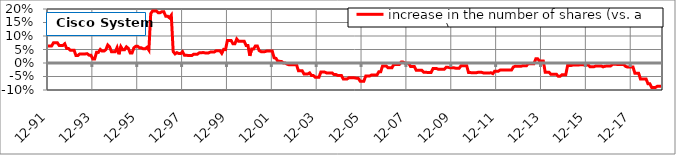
| Category | increase in the number of shares (vs. a year ago) |
|---|---|
| 1991-12-31 | 0.063 |
| 1992-01-31 | 0.063 |
| 1992-02-28 | 0.063 |
| 1992-03-31 | 0.075 |
| 1992-04-30 | 0.075 |
| 1992-05-29 | 0.075 |
| 1992-06-30 | 0.065 |
| 1992-07-31 | 0.065 |
| 1992-08-31 | 0.065 |
| 1992-09-30 | 0.071 |
| 1992-10-30 | 0.054 |
| 1992-11-30 | 0.054 |
| 1992-12-31 | 0.047 |
| 1993-01-29 | 0.047 |
| 1993-02-26 | 0.047 |
| 1993-03-31 | 0.027 |
| 1993-04-30 | 0.028 |
| 1993-05-31 | 0.034 |
| 1993-06-30 | 0.034 |
| 1993-07-30 | 0.034 |
| 1993-08-31 | 0.034 |
| 1993-09-30 | 0.034 |
| 1993-10-29 | 0.029 |
| 1993-11-30 | 0.029 |
| 1993-12-31 | 0.015 |
| 1994-01-31 | 0.015 |
| 1994-02-28 | 0.039 |
| 1994-03-31 | 0.039 |
| 1994-04-29 | 0.05 |
| 1994-05-31 | 0.044 |
| 1994-06-30 | 0.044 |
| 1994-07-29 | 0.05 |
| 1994-08-31 | 0.067 |
| 1994-09-30 | 0.06 |
| 1994-10-31 | 0.042 |
| 1994-11-30 | 0.042 |
| 1994-12-30 | 0.042 |
| 1995-01-31 | 0.057 |
| 1995-02-28 | 0.032 |
| 1995-03-31 | 0.06 |
| 1995-04-28 | 0.049 |
| 1995-05-31 | 0.049 |
| 1995-06-30 | 0.06 |
| 1995-07-31 | 0.054 |
| 1995-08-31 | 0.037 |
| 1995-09-29 | 0.037 |
| 1995-10-31 | 0.056 |
| 1995-11-30 | 0.062 |
| 1995-12-29 | 0.062 |
| 1996-01-31 | 0.056 |
| 1996-02-29 | 0.056 |
| 1996-03-29 | 0.052 |
| 1996-04-30 | 0.052 |
| 1996-05-31 | 0.058 |
| 1996-06-28 | 0.048 |
| 1996-07-31 | 0.183 |
| 1996-08-30 | 0.193 |
| 1996-09-30 | 0.193 |
| 1996-10-31 | 0.192 |
| 1996-11-29 | 0.186 |
| 1996-12-31 | 0.186 |
| 1997-01-31 | 0.19 |
| 1997-02-28 | 0.19 |
| 1997-03-31 | 0.174 |
| 1997-04-30 | 0.174 |
| 1997-05-30 | 0.167 |
| 1997-06-30 | 0.177 |
| 1997-07-31 | 0.042 |
| 1997-08-29 | 0.034 |
| 1997-09-30 | 0.038 |
| 1997-10-31 | 0.035 |
| 1997-11-28 | 0.035 |
| 1997-12-31 | 0.042 |
| 1998-01-30 | 0.029 |
| 1998-02-27 | 0.029 |
| 1998-03-31 | 0.028 |
| 1998-04-30 | 0.028 |
| 1998-05-29 | 0.028 |
| 1998-06-30 | 0.033 |
| 1998-07-31 | 0.033 |
| 1998-08-31 | 0.033 |
| 1998-09-30 | 0.038 |
| 1998-10-30 | 0.038 |
| 1998-11-30 | 0.039 |
| 1998-12-31 | 0.037 |
| 1999-01-29 | 0.037 |
| 1999-02-26 | 0.037 |
| 1999-03-31 | 0.041 |
| 1999-04-30 | 0.041 |
| 1999-05-31 | 0.041 |
| 1999-06-30 | 0.045 |
| 1999-07-30 | 0.045 |
| 1999-08-31 | 0.045 |
| 1999-09-30 | 0.036 |
| 1999-10-29 | 0.051 |
| 1999-11-30 | 0.05 |
| 1999-12-31 | 0.083 |
| 2000-01-31 | 0.083 |
| 2000-02-29 | 0.083 |
| 2000-03-31 | 0.071 |
| 2000-04-28 | 0.071 |
| 2000-05-31 | 0.089 |
| 2000-06-30 | 0.08 |
| 2000-07-31 | 0.08 |
| 2000-08-31 | 0.08 |
| 2000-09-29 | 0.08 |
| 2000-10-31 | 0.065 |
| 2000-11-30 | 0.065 |
| 2000-12-29 | 0.027 |
| 2001-01-31 | 0.052 |
| 2001-02-28 | 0.052 |
| 2001-03-30 | 0.063 |
| 2001-04-30 | 0.063 |
| 2001-05-31 | 0.046 |
| 2001-06-29 | 0.042 |
| 2001-07-31 | 0.042 |
| 2001-08-31 | 0.042 |
| 2001-09-28 | 0.044 |
| 2001-10-31 | 0.044 |
| 2001-11-30 | 0.044 |
| 2001-12-31 | 0.044 |
| 2002-01-31 | 0.019 |
| 2002-02-28 | 0.017 |
| 2002-03-29 | 0.006 |
| 2002-04-30 | 0.006 |
| 2002-05-31 | 0.006 |
| 2002-06-28 | 0 |
| 2002-07-31 | 0 |
| 2002-08-30 | -0.005 |
| 2002-09-30 | -0.007 |
| 2002-10-31 | -0.007 |
| 2002-11-29 | -0.007 |
| 2002-12-31 | -0.007 |
| 2003-01-31 | -0.007 |
| 2003-02-28 | -0.029 |
| 2003-03-31 | -0.029 |
| 2003-04-30 | -0.029 |
| 2003-05-30 | -0.041 |
| 2003-06-30 | -0.041 |
| 2003-07-31 | -0.041 |
| 2003-08-29 | -0.037 |
| 2003-09-30 | -0.046 |
| 2003-10-31 | -0.046 |
| 2003-11-28 | -0.053 |
| 2003-12-31 | -0.053 |
| 2004-01-30 | -0.053 |
| 2004-02-27 | -0.034 |
| 2004-03-31 | -0.034 |
| 2004-04-30 | -0.034 |
| 2004-05-31 | -0.037 |
| 2004-06-30 | -0.037 |
| 2004-07-30 | -0.037 |
| 2004-08-31 | -0.037 |
| 2004-09-30 | -0.043 |
| 2004-10-29 | -0.043 |
| 2004-11-30 | -0.046 |
| 2004-12-31 | -0.046 |
| 2005-01-31 | -0.046 |
| 2005-02-28 | -0.059 |
| 2005-03-31 | -0.059 |
| 2005-04-29 | -0.059 |
| 2005-05-31 | -0.055 |
| 2005-06-30 | -0.055 |
| 2005-07-29 | -0.055 |
| 2005-08-31 | -0.055 |
| 2005-09-30 | -0.056 |
| 2005-10-31 | -0.057 |
| 2005-11-30 | -0.067 |
| 2005-12-30 | -0.067 |
| 2006-01-31 | -0.067 |
| 2006-02-28 | -0.048 |
| 2006-03-31 | -0.048 |
| 2006-04-28 | -0.048 |
| 2006-05-31 | -0.045 |
| 2006-06-30 | -0.045 |
| 2006-07-31 | -0.045 |
| 2006-08-31 | -0.045 |
| 2006-09-29 | -0.033 |
| 2006-10-31 | -0.033 |
| 2006-11-30 | -0.011 |
| 2006-12-29 | -0.011 |
| 2007-01-31 | -0.011 |
| 2007-02-28 | -0.018 |
| 2007-03-30 | -0.018 |
| 2007-04-30 | -0.018 |
| 2007-05-31 | -0.005 |
| 2007-06-29 | -0.005 |
| 2007-07-31 | -0.005 |
| 2007-08-31 | -0.005 |
| 2007-09-28 | 0.003 |
| 2007-10-31 | 0.003 |
| 2007-11-30 | -0.001 |
| 2007-12-31 | -0.001 |
| 2008-01-31 | -0.001 |
| 2008-02-29 | -0.013 |
| 2008-03-31 | -0.013 |
| 2008-04-30 | -0.013 |
| 2008-05-30 | -0.027 |
| 2008-06-30 | -0.027 |
| 2008-07-31 | -0.027 |
| 2008-08-29 | -0.027 |
| 2008-09-30 | -0.034 |
| 2008-10-31 | -0.034 |
| 2008-11-28 | -0.035 |
| 2008-12-31 | -0.035 |
| 2009-01-30 | -0.035 |
| 2009-02-27 | -0.021 |
| 2009-03-31 | -0.021 |
| 2009-04-30 | -0.021 |
| 2009-05-29 | -0.024 |
| 2009-06-30 | -0.024 |
| 2009-07-31 | -0.024 |
| 2009-08-31 | -0.024 |
| 2009-09-30 | -0.016 |
| 2009-10-30 | -0.016 |
| 2009-11-30 | -0.018 |
| 2009-12-31 | -0.018 |
| 2010-01-29 | -0.018 |
| 2010-02-26 | -0.019 |
| 2010-03-31 | -0.019 |
| 2010-04-30 | -0.019 |
| 2010-05-31 | -0.01 |
| 2010-06-30 | -0.01 |
| 2010-07-30 | -0.01 |
| 2010-08-31 | -0.01 |
| 2010-09-30 | -0.035 |
| 2010-10-29 | -0.035 |
| 2010-11-30 | -0.036 |
| 2010-12-31 | -0.036 |
| 2011-01-31 | -0.036 |
| 2011-02-28 | -0.035 |
| 2011-03-31 | -0.035 |
| 2011-04-29 | -0.035 |
| 2011-05-31 | -0.037 |
| 2011-06-30 | -0.037 |
| 2011-07-29 | -0.037 |
| 2011-08-31 | -0.037 |
| 2011-09-30 | -0.036 |
| 2011-10-31 | -0.039 |
| 2011-11-30 | -0.03 |
| 2011-12-30 | -0.03 |
| 2012-01-31 | -0.03 |
| 2012-02-29 | -0.026 |
| 2012-03-30 | -0.026 |
| 2012-04-30 | -0.026 |
| 2012-05-31 | -0.026 |
| 2012-06-29 | -0.026 |
| 2012-07-31 | -0.026 |
| 2012-08-31 | -0.026 |
| 2012-09-28 | -0.015 |
| 2012-10-31 | -0.012 |
| 2012-11-30 | -0.012 |
| 2012-12-31 | -0.012 |
| 2013-01-31 | -0.012 |
| 2013-02-28 | -0.01 |
| 2013-03-29 | -0.01 |
| 2013-04-30 | -0.01 |
| 2013-05-31 | -0.002 |
| 2013-06-28 | -0.002 |
| 2013-07-31 | -0.002 |
| 2013-08-30 | -0.002 |
| 2013-09-30 | 0.015 |
| 2013-10-31 | 0.015 |
| 2013-11-30 | 0.007 |
| 2013-12-31 | 0.007 |
| 2014-01-31 | 0.007 |
| 2014-02-28 | -0.034 |
| 2014-03-31 | -0.034 |
| 2014-04-30 | -0.034 |
| 2014-05-31 | -0.041 |
| 2014-06-30 | -0.041 |
| 2014-07-31 | -0.041 |
| 2014-08-31 | -0.041 |
| 2014-09-30 | -0.049 |
| 2014-10-31 | -0.049 |
| 2014-11-30 | -0.044 |
| 2014-12-31 | -0.044 |
| 2015-01-30 | -0.044 |
| 2015-02-27 | -0.009 |
| 2015-03-31 | -0.009 |
| 2015-04-30 | -0.009 |
| 2015-05-29 | -0.007 |
| 2015-06-30 | -0.007 |
| 2015-07-31 | -0.007 |
| 2015-08-31 | -0.007 |
| 2015-09-30 | -0.006 |
| 2015-10-30 | -0.006 |
| 2015-11-30 | -0.007 |
| 2015-12-31 | -0.007 |
| 2016-01-29 | -0.007 |
| 2016-02-29 | -0.014 |
| 2016-03-31 | -0.014 |
| 2016-04-29 | -0.014 |
| 2016-05-31 | -0.011 |
| 2016-06-30 | -0.011 |
| 2016-07-29 | -0.011 |
| 2016-08-31 | -0.011 |
| 2016-09-30 | -0.014 |
| 2016-10-31 | -0.012 |
| 2016-11-30 | -0.011 |
| 2016-12-30 | -0.011 |
| 2017-01-31 | -0.011 |
| 2017-02-28 | -0.005 |
| 2017-03-31 | -0.005 |
| 2017-04-28 | -0.005 |
| 2017-05-31 | -0.006 |
| 2017-06-30 | -0.006 |
| 2017-07-31 | -0.006 |
| 2017-08-31 | -0.006 |
| 2017-09-29 | -0.012 |
| 2017-10-31 | -0.015 |
| 2017-11-30 | -0.015 |
| 2017-12-29 | -0.015 |
| 2018-01-31 | -0.015 |
| 2018-02-28 | -0.038 |
| 2018-03-30 | -0.038 |
| 2018-04-30 | -0.038 |
| 2018-05-31 | -0.059 |
| 2018-06-29 | -0.059 |
| 2018-07-31 | -0.059 |
| 2018-08-31 | -0.059 |
| 2018-09-28 | -0.077 |
| 2018-10-31 | -0.077 |
| 2018-11-30 | -0.091 |
| 2018-12-31 | -0.091 |
| 2019-01-31 | -0.091 |
| 2019-02-28 | -0.086 |
| 2019-03-29 | -0.086 |
| 2019-04-30 | -0.086 |